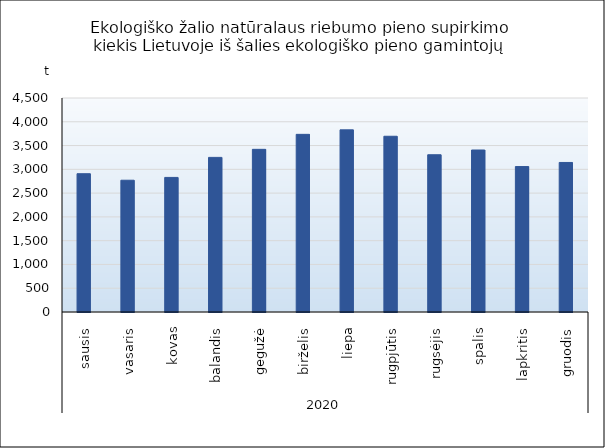
| Category | Ekologiško žalio natūralaus riebumo pieno supirkimo kiekis Lietuvoje iš šalies ekologiško pieno gamintojų |
|---|---|
| 0 | 2908.043 |
| 1 | 2771.079 |
| 2 | 2829.965 |
| 3 | 3251.285 |
| 4 | 3420.496 |
| 5 | 3735.632 |
| 6 | 3830.149 |
| 7 | 3695.515 |
| 8 | 3306.712 |
| 9 | 3406.479 |
| 10 | 3058.35 |
| 11 | 3144.398 |